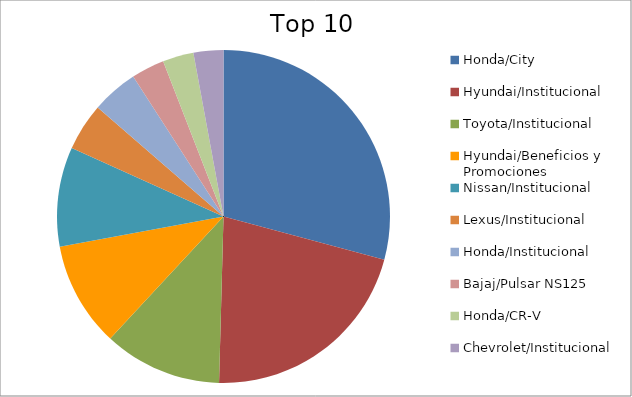
| Category | Series 0 |
|---|---|
| Honda/City | 24.66 |
| Hyundai/Institucional | 17.95 |
| Toyota/Institucional | 9.7 |
| Hyundai/Beneficios y Promociones | 8.61 |
| Nissan/Institucional | 8.16 |
| Lexus/Institucional | 3.9 |
| Honda/Institucional | 3.81 |
| Bajaj/Pulsar NS125 | 2.72 |
| Honda/CR-V | 2.54 |
| Chevrolet/Institucional | 2.45 |